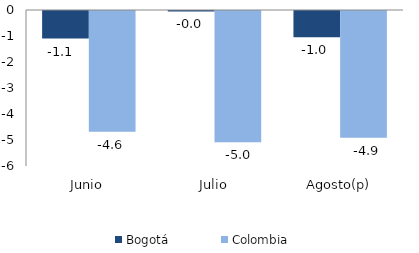
| Category | Bogotá | Colombia |
|---|---|---|
| Junio | -1.062 | -4.642 |
| Julio | -0.019 | -5.044 |
| Agosto(p) | -1.006 | -4.875 |